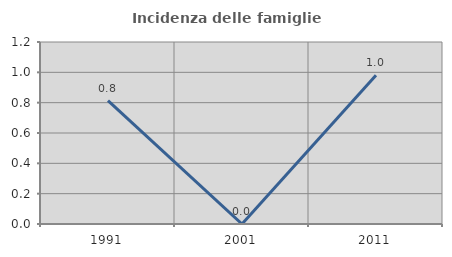
| Category | Incidenza delle famiglie numerose |
|---|---|
| 1991.0 | 0.813 |
| 2001.0 | 0 |
| 2011.0 | 0.98 |